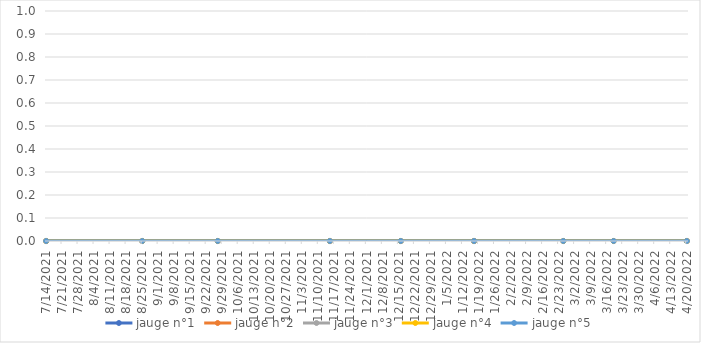
| Category | jauge n°1 | jauge n°2 | jauge n°3 | jauge n°4 | jauge n°5 |
|---|---|---|---|---|---|
| 7/14/21 | 0 | 0 | 0 | 0 | 0 |
| 8/25/21 | 0 | 0 | 0 | 0 | 0 |
| 9/27/21 | 0 | 0 | 0 | 0 | 0 |
| 11/15/21 | 0 | 0 | 0 | 0 | 0 |
| 12/16/21 | 0 | 0 | 0 | 0 | 0 |
| 1/17/22 | 0 | 0 | 0 | 0 | 0 |
| 2/25/22 | 0 | 0 | 0 | 0 | 0 |
| 3/19/22 | 0 | 0 | 0 | 0 | 0 |
| 4/20/22 | 0 | 0 | 0 | 0 | 0 |